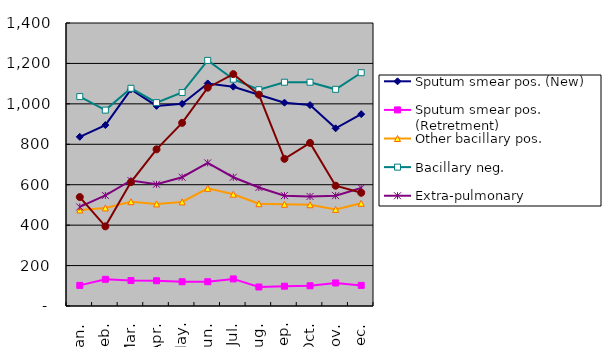
| Category | Sputum smear pos. (New) | Sputum smear pos. (Retretment) | Other bacillary pos. | Bacillary neg. | Extra-pulmonary | Chemopro-phylaxis* |
|---|---|---|---|---|---|---|
| Jan. | 837 | 102 | 475 | 1036 | 490 | 539 |
| Feb. | 895 | 132 | 485 | 969 | 547 | 394 |
| Mar. | 1072 | 126 | 516 | 1077 | 621 | 613 |
| Apr. | 990 | 125 | 505 | 1006 | 602 | 775 |
| May. | 1000 | 120 | 515 | 1056 | 637 | 906 |
| Jun. | 1101 | 120 | 582 | 1215 | 708 | 1080 |
| Jul. | 1085 | 134 | 553 | 1122 | 637 | 1147 |
| Aug. | 1045 | 94 | 506 | 1070 | 586 | 1046 |
| Sep. | 1006 | 98 | 503 | 1107 | 546 | 728 |
| Oct. | 994 | 100 | 501 | 1107 | 542 | 807 |
| Nov. | 879 | 114 | 478 | 1072 | 546 | 595 |
| Dec. | 949 | 102 | 508 | 1154 | 584 | 560 |